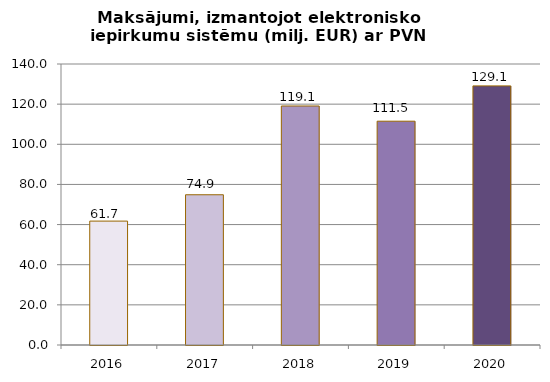
| Category | Maksājumi, izmantojot elektronisko iepirkumu sistēmu (milj. EUR) ar PVN |
|---|---|
| 2016.0 | 61.731 |
| 2017.0 | 74.856 |
| 2018.0 | 119.077 |
| 2019.0 | 111.503 |
| 2020.0 | 129.092 |